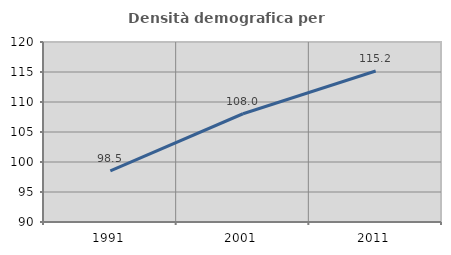
| Category | Densità demografica |
|---|---|
| 1991.0 | 98.511 |
| 2001.0 | 108.042 |
| 2011.0 | 115.16 |